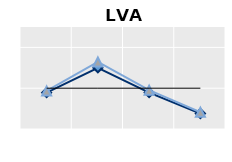
| Category | Né à l'étranger | Né dans le pays | Series 1 |
|---|---|---|---|
| 15-24 | 0.892 | 0.932 | 1 |
| 25-54 | 1.501 | 1.644 | 1 |
| 55-64 | 0.89 | 0.951 | 1 |
| 65+ | 0.379 | 0.411 | 1 |